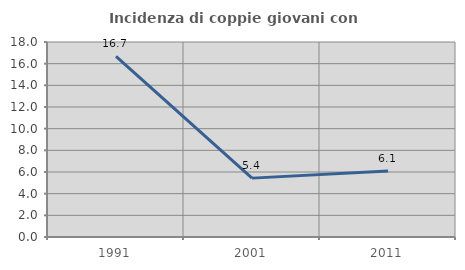
| Category | Incidenza di coppie giovani con figli |
|---|---|
| 1991.0 | 16.667 |
| 2001.0 | 5.435 |
| 2011.0 | 6.098 |